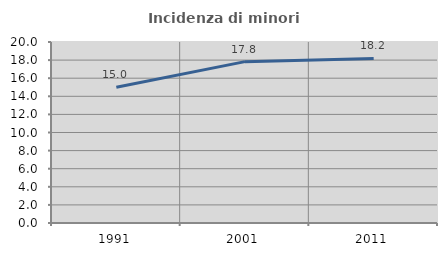
| Category | Incidenza di minori stranieri |
|---|---|
| 1991.0 | 15 |
| 2001.0 | 17.829 |
| 2011.0 | 18.182 |